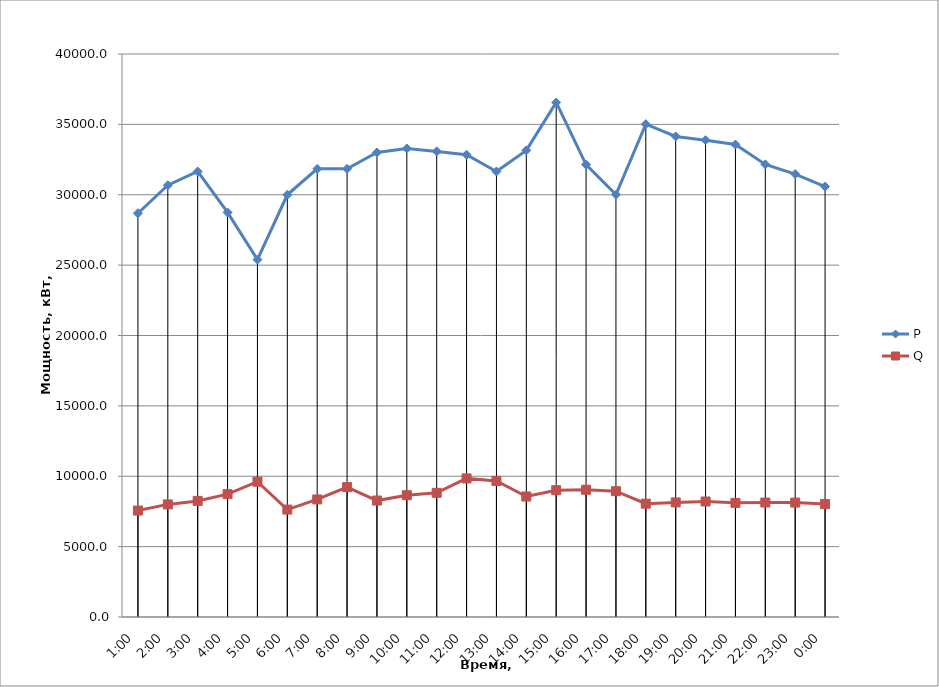
| Category | P | Q |
|---|---|---|
| 2009-12-17 01:00:00 | 28687.28 | 7562.36 |
| 2009-12-16 02:00:00 | 30674.4 | 8000.08 |
| 2009-12-15 03:00:00 | 31652.84 | 8248.76 |
| 2009-12-14 04:00:00 | 28742.8 | 8727.16 |
| 2009-12-13 05:00:00 | 25391.24 | 9610.4 |
| 2009-12-12 06:00:00 | 29999.36 | 7631.88 |
| 2009-12-11 07:00:00 | 31838.72 | 8352.36 |
| 2009-12-10 08:00:00 | 31840.68 | 9229.88 |
| 2009-12-09 09:00:00 | 33002.68 | 8272.28 |
| 2009-12-08 10:00:00 | 33287.76 | 8653.2 |
| 2009-12-07 11:00:00 | 33079.92 | 8821.16 |
| 2009-12-06 12:00:00 | 32841.6 | 9847.16 |
| 2009-12-05 13:00:00 | 31655.12 | 9667.08 |
| 2009-12-04 14:00:00 | 33152.28 | 8559.84 |
| 2009-12-03 15:00:00 | 36557 | 9011.72 |
| 2009-12-02 16:00:00 | 32137.32 | 9041.44 |
| 2009-12-01 17:00:00 | 30004.84 | 8940.36 |
| 2009-11-30 18:00:00 | 35014.52 | 8052.44 |
| 2009-11-29 19:00:00 | 34144.24 | 8142.44 |
| 2009-11-28 20:00:00 | 33878.96 | 8207.32 |
| 2009-11-27 21:00:00 | 33569.76 | 8108.64 |
| 2009-11-26 22:00:00 | 32157.2 | 8133.24 |
| 2009-11-25 23:00:00 | 31468.12 | 8129.28 |
| 2009-11-25 | 30580.88 | 8021.04 |